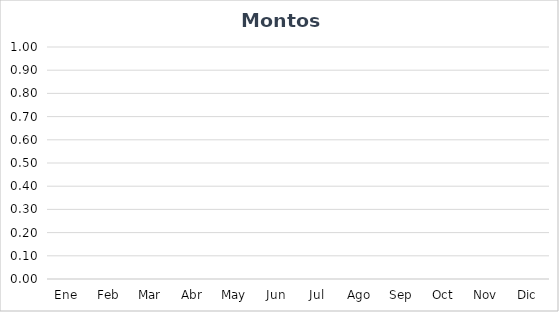
| Category | Series 0 | Monto |
|---|---|---|
| Ene | 0 |  |
| Feb | 0 |  |
| Mar | 0 |  |
| Abr | 0 |  |
| May | 0 |  |
| Jun | 0 |  |
| Jul | 0 |  |
| Ago | 0 |  |
| Sep | 0 |  |
| Oct | 0 |  |
| Nov | 0 |  |
| Dic | 0 |  |